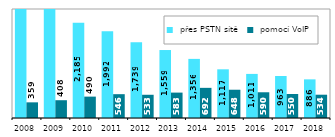
| Category |  přes PSTN sítě |  pomocí VoIP |
|---|---|---|
| 2008.0 | 3170 | 359 |
| 2009.0 | 2528.931 | 407.843 |
| 2010.0 | 2185.278 | 490.4 |
| 2011.0 | 1991.609 | 546.345 |
| 2012.0 | 1739.366 | 532.765 |
| 2013.0 | 1558.951 | 582.568 |
| 2014.0 | 1355.736 | 691.505 |
| 2015.0 | 1116.653 | 648.309 |
| 2016.0 | 1011.173 | 590.209 |
| 2017.0 | 963.232 | 550.403 |
| 2018.0 | 886.235 | 534.114 |